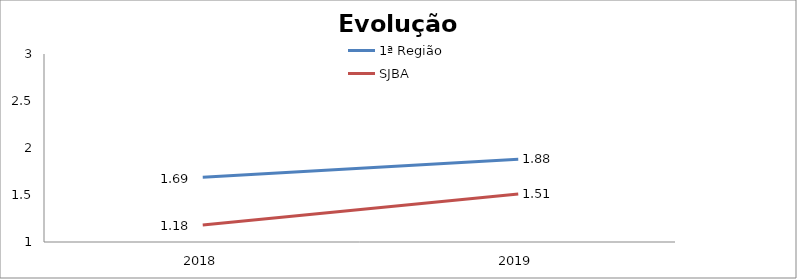
| Category | 1ª Região | SJBA |
|---|---|---|
| 0 | 1.69 | 1.18 |
| 1 | 1.88 | 1.51 |